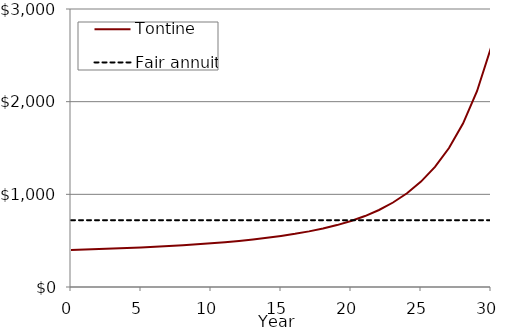
| Category | Tontine | Fair annuity |
|---|---|---|
| 0.0 | 400 | 720.738 |
| nan | 404.531 | 720.738 |
| nan | 409.495 | 720.738 |
| nan | 414.924 | 720.738 |
| nan | 420.834 | 720.738 |
| 5.0 | 427.267 | 720.738 |
| nan | 434.313 | 720.738 |
| nan | 442.095 | 720.738 |
| nan | 450.726 | 720.738 |
| nan | 460.341 | 720.738 |
| 10.0 | 471.104 | 720.738 |
| nan | 483.268 | 720.738 |
| nan | 497.097 | 720.738 |
| nan | 512.789 | 720.738 |
| nan | 530.535 | 720.738 |
| 15.0 | 550.637 | 720.738 |
| nan | 573.606 | 720.738 |
| nan | 600.166 | 720.738 |
| nan | 631.231 | 720.738 |
| nan | 668.044 | 720.738 |
| 20.0 | 712.204 | 720.738 |
| nan | 765.722 | 720.738 |
| nan | 831.141 | 720.738 |
| nan | 911.734 | 720.738 |
| nan | 1011.817 | 720.738 |
| 25.0 | 1137.23 | 720.738 |
| nan | 1296.035 | 720.738 |
| nan | 1499.559 | 720.738 |
| nan | 1764.02 | 720.738 |
| nan | 2113.07 | 720.738 |
| 30.0 | 2581.907 | 720.738 |